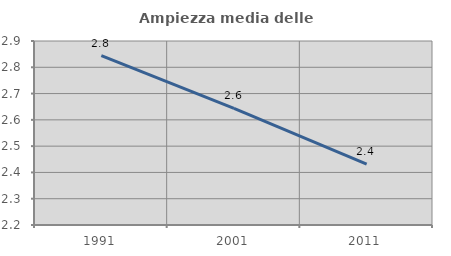
| Category | Ampiezza media delle famiglie |
|---|---|
| 1991.0 | 2.845 |
| 2001.0 | 2.644 |
| 2011.0 | 2.432 |